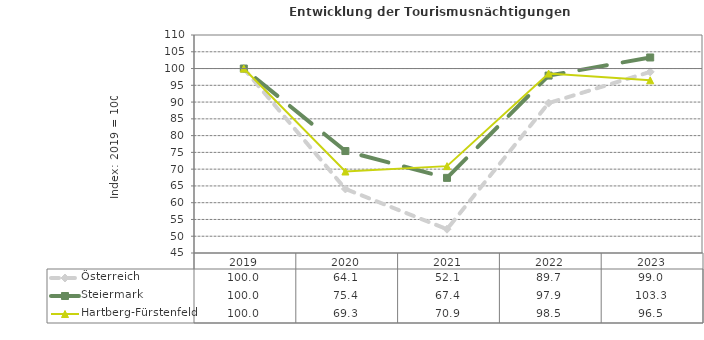
| Category | Österreich | Steiermark | Hartberg-Fürstenfeld |
|---|---|---|---|
| 2023.0 | 99 | 103.3 | 96.5 |
| 2022.0 | 89.7 | 97.9 | 98.5 |
| 2021.0 | 52.1 | 67.4 | 70.9 |
| 2020.0 | 64.1 | 75.4 | 69.3 |
| 2019.0 | 100 | 100 | 100 |